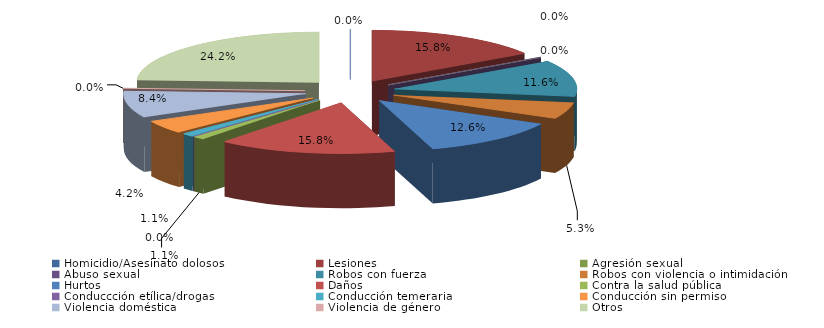
| Category | Series 0 |
|---|---|
| Homicidio/Asesinato dolosos | 0 |
| Lesiones | 15 |
| Agresión sexual | 0 |
| Abuso sexual | 0 |
| Robos con fuerza | 11 |
| Robos con violencia o intimidación | 5 |
| Hurtos | 12 |
| Daños | 15 |
| Contra la salud pública | 1 |
| Conduccción etílica/drogas | 0 |
| Conducción temeraria | 1 |
| Conducción sin permiso | 4 |
| Violencia doméstica | 8 |
| Violencia de género | 0 |
| Otros | 23 |